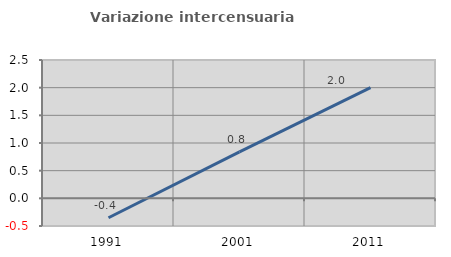
| Category | Variazione intercensuaria annua |
|---|---|
| 1991.0 | -0.35 |
| 2001.0 | 0.841 |
| 2011.0 | 2 |